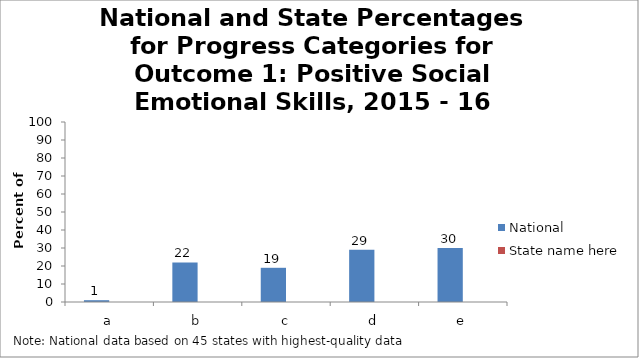
| Category | National | State name here |
|---|---|---|
| a | 1 |  |
| b | 22 |  |
| c | 19 |  |
| d | 29 |  |
| e | 30 |  |